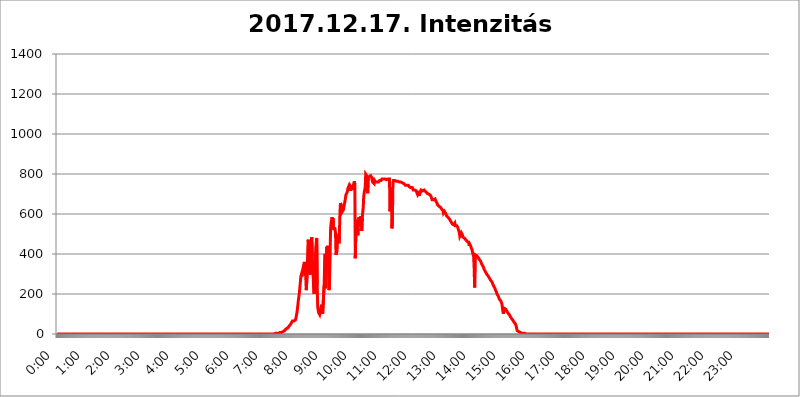
| Category | 2017.12.17. Intenzitás [W/m^2] |
|---|---|
| 0.0 | 0 |
| 0.0006944444444444445 | 0 |
| 0.001388888888888889 | 0 |
| 0.0020833333333333333 | 0 |
| 0.002777777777777778 | 0 |
| 0.003472222222222222 | 0 |
| 0.004166666666666667 | 0 |
| 0.004861111111111111 | 0 |
| 0.005555555555555556 | 0 |
| 0.0062499999999999995 | 0 |
| 0.006944444444444444 | 0 |
| 0.007638888888888889 | 0 |
| 0.008333333333333333 | 0 |
| 0.009027777777777779 | 0 |
| 0.009722222222222222 | 0 |
| 0.010416666666666666 | 0 |
| 0.011111111111111112 | 0 |
| 0.011805555555555555 | 0 |
| 0.012499999999999999 | 0 |
| 0.013194444444444444 | 0 |
| 0.013888888888888888 | 0 |
| 0.014583333333333332 | 0 |
| 0.015277777777777777 | 0 |
| 0.015972222222222224 | 0 |
| 0.016666666666666666 | 0 |
| 0.017361111111111112 | 0 |
| 0.018055555555555557 | 0 |
| 0.01875 | 0 |
| 0.019444444444444445 | 0 |
| 0.02013888888888889 | 0 |
| 0.020833333333333332 | 0 |
| 0.02152777777777778 | 0 |
| 0.022222222222222223 | 0 |
| 0.02291666666666667 | 0 |
| 0.02361111111111111 | 0 |
| 0.024305555555555556 | 0 |
| 0.024999999999999998 | 0 |
| 0.025694444444444447 | 0 |
| 0.02638888888888889 | 0 |
| 0.027083333333333334 | 0 |
| 0.027777777777777776 | 0 |
| 0.02847222222222222 | 0 |
| 0.029166666666666664 | 0 |
| 0.029861111111111113 | 0 |
| 0.030555555555555555 | 0 |
| 0.03125 | 0 |
| 0.03194444444444445 | 0 |
| 0.03263888888888889 | 0 |
| 0.03333333333333333 | 0 |
| 0.034027777777777775 | 0 |
| 0.034722222222222224 | 0 |
| 0.035416666666666666 | 0 |
| 0.036111111111111115 | 0 |
| 0.03680555555555556 | 0 |
| 0.0375 | 0 |
| 0.03819444444444444 | 0 |
| 0.03888888888888889 | 0 |
| 0.03958333333333333 | 0 |
| 0.04027777777777778 | 0 |
| 0.04097222222222222 | 0 |
| 0.041666666666666664 | 0 |
| 0.042361111111111106 | 0 |
| 0.04305555555555556 | 0 |
| 0.043750000000000004 | 0 |
| 0.044444444444444446 | 0 |
| 0.04513888888888889 | 0 |
| 0.04583333333333334 | 0 |
| 0.04652777777777778 | 0 |
| 0.04722222222222222 | 0 |
| 0.04791666666666666 | 0 |
| 0.04861111111111111 | 0 |
| 0.049305555555555554 | 0 |
| 0.049999999999999996 | 0 |
| 0.05069444444444445 | 0 |
| 0.051388888888888894 | 0 |
| 0.052083333333333336 | 0 |
| 0.05277777777777778 | 0 |
| 0.05347222222222222 | 0 |
| 0.05416666666666667 | 0 |
| 0.05486111111111111 | 0 |
| 0.05555555555555555 | 0 |
| 0.05625 | 0 |
| 0.05694444444444444 | 0 |
| 0.057638888888888885 | 0 |
| 0.05833333333333333 | 0 |
| 0.05902777777777778 | 0 |
| 0.059722222222222225 | 0 |
| 0.06041666666666667 | 0 |
| 0.061111111111111116 | 0 |
| 0.06180555555555556 | 0 |
| 0.0625 | 0 |
| 0.06319444444444444 | 0 |
| 0.06388888888888888 | 0 |
| 0.06458333333333334 | 0 |
| 0.06527777777777778 | 0 |
| 0.06597222222222222 | 0 |
| 0.06666666666666667 | 0 |
| 0.06736111111111111 | 0 |
| 0.06805555555555555 | 0 |
| 0.06874999999999999 | 0 |
| 0.06944444444444443 | 0 |
| 0.07013888888888889 | 0 |
| 0.07083333333333333 | 0 |
| 0.07152777777777779 | 0 |
| 0.07222222222222223 | 0 |
| 0.07291666666666667 | 0 |
| 0.07361111111111111 | 0 |
| 0.07430555555555556 | 0 |
| 0.075 | 0 |
| 0.07569444444444444 | 0 |
| 0.0763888888888889 | 0 |
| 0.07708333333333334 | 0 |
| 0.07777777777777778 | 0 |
| 0.07847222222222222 | 0 |
| 0.07916666666666666 | 0 |
| 0.0798611111111111 | 0 |
| 0.08055555555555556 | 0 |
| 0.08125 | 0 |
| 0.08194444444444444 | 0 |
| 0.08263888888888889 | 0 |
| 0.08333333333333333 | 0 |
| 0.08402777777777777 | 0 |
| 0.08472222222222221 | 0 |
| 0.08541666666666665 | 0 |
| 0.08611111111111112 | 0 |
| 0.08680555555555557 | 0 |
| 0.08750000000000001 | 0 |
| 0.08819444444444445 | 0 |
| 0.08888888888888889 | 0 |
| 0.08958333333333333 | 0 |
| 0.09027777777777778 | 0 |
| 0.09097222222222222 | 0 |
| 0.09166666666666667 | 0 |
| 0.09236111111111112 | 0 |
| 0.09305555555555556 | 0 |
| 0.09375 | 0 |
| 0.09444444444444444 | 0 |
| 0.09513888888888888 | 0 |
| 0.09583333333333333 | 0 |
| 0.09652777777777777 | 0 |
| 0.09722222222222222 | 0 |
| 0.09791666666666667 | 0 |
| 0.09861111111111111 | 0 |
| 0.09930555555555555 | 0 |
| 0.09999999999999999 | 0 |
| 0.10069444444444443 | 0 |
| 0.1013888888888889 | 0 |
| 0.10208333333333335 | 0 |
| 0.10277777777777779 | 0 |
| 0.10347222222222223 | 0 |
| 0.10416666666666667 | 0 |
| 0.10486111111111111 | 0 |
| 0.10555555555555556 | 0 |
| 0.10625 | 0 |
| 0.10694444444444444 | 0 |
| 0.1076388888888889 | 0 |
| 0.10833333333333334 | 0 |
| 0.10902777777777778 | 0 |
| 0.10972222222222222 | 0 |
| 0.1111111111111111 | 0 |
| 0.11180555555555556 | 0 |
| 0.11180555555555556 | 0 |
| 0.1125 | 0 |
| 0.11319444444444444 | 0 |
| 0.11388888888888889 | 0 |
| 0.11458333333333333 | 0 |
| 0.11527777777777777 | 0 |
| 0.11597222222222221 | 0 |
| 0.11666666666666665 | 0 |
| 0.1173611111111111 | 0 |
| 0.11805555555555557 | 0 |
| 0.11944444444444445 | 0 |
| 0.12013888888888889 | 0 |
| 0.12083333333333333 | 0 |
| 0.12152777777777778 | 0 |
| 0.12222222222222223 | 0 |
| 0.12291666666666667 | 0 |
| 0.12291666666666667 | 0 |
| 0.12361111111111112 | 0 |
| 0.12430555555555556 | 0 |
| 0.125 | 0 |
| 0.12569444444444444 | 0 |
| 0.12638888888888888 | 0 |
| 0.12708333333333333 | 0 |
| 0.16875 | 0 |
| 0.12847222222222224 | 0 |
| 0.12916666666666668 | 0 |
| 0.12986111111111112 | 0 |
| 0.13055555555555556 | 0 |
| 0.13125 | 0 |
| 0.13194444444444445 | 0 |
| 0.1326388888888889 | 0 |
| 0.13333333333333333 | 0 |
| 0.13402777777777777 | 0 |
| 0.13402777777777777 | 0 |
| 0.13472222222222222 | 0 |
| 0.13541666666666666 | 0 |
| 0.1361111111111111 | 0 |
| 0.13749999999999998 | 0 |
| 0.13819444444444443 | 0 |
| 0.1388888888888889 | 0 |
| 0.13958333333333334 | 0 |
| 0.14027777777777778 | 0 |
| 0.14097222222222222 | 0 |
| 0.14166666666666666 | 0 |
| 0.1423611111111111 | 0 |
| 0.14305555555555557 | 0 |
| 0.14375000000000002 | 0 |
| 0.14444444444444446 | 0 |
| 0.1451388888888889 | 0 |
| 0.1451388888888889 | 0 |
| 0.14652777777777778 | 0 |
| 0.14722222222222223 | 0 |
| 0.14791666666666667 | 0 |
| 0.1486111111111111 | 0 |
| 0.14930555555555555 | 0 |
| 0.15 | 0 |
| 0.15069444444444444 | 0 |
| 0.15138888888888888 | 0 |
| 0.15208333333333332 | 0 |
| 0.15277777777777776 | 0 |
| 0.15347222222222223 | 0 |
| 0.15416666666666667 | 0 |
| 0.15486111111111112 | 0 |
| 0.15555555555555556 | 0 |
| 0.15625 | 0 |
| 0.15694444444444444 | 0 |
| 0.15763888888888888 | 0 |
| 0.15833333333333333 | 0 |
| 0.15902777777777777 | 0 |
| 0.15972222222222224 | 0 |
| 0.16041666666666668 | 0 |
| 0.16111111111111112 | 0 |
| 0.16180555555555556 | 0 |
| 0.1625 | 0 |
| 0.16319444444444445 | 0 |
| 0.1638888888888889 | 0 |
| 0.16458333333333333 | 0 |
| 0.16527777777777777 | 0 |
| 0.16597222222222222 | 0 |
| 0.16666666666666666 | 0 |
| 0.1673611111111111 | 0 |
| 0.16805555555555554 | 0 |
| 0.16874999999999998 | 0 |
| 0.16944444444444443 | 0 |
| 0.17013888888888887 | 0 |
| 0.1708333333333333 | 0 |
| 0.17152777777777775 | 0 |
| 0.17222222222222225 | 0 |
| 0.1729166666666667 | 0 |
| 0.17361111111111113 | 0 |
| 0.17430555555555557 | 0 |
| 0.17500000000000002 | 0 |
| 0.17569444444444446 | 0 |
| 0.1763888888888889 | 0 |
| 0.17708333333333334 | 0 |
| 0.17777777777777778 | 0 |
| 0.17847222222222223 | 0 |
| 0.17916666666666667 | 0 |
| 0.1798611111111111 | 0 |
| 0.18055555555555555 | 0 |
| 0.18125 | 0 |
| 0.18194444444444444 | 0 |
| 0.1826388888888889 | 0 |
| 0.18333333333333335 | 0 |
| 0.1840277777777778 | 0 |
| 0.18472222222222223 | 0 |
| 0.18541666666666667 | 0 |
| 0.18611111111111112 | 0 |
| 0.18680555555555556 | 0 |
| 0.1875 | 0 |
| 0.18819444444444444 | 0 |
| 0.18888888888888888 | 0 |
| 0.18958333333333333 | 0 |
| 0.19027777777777777 | 0 |
| 0.1909722222222222 | 0 |
| 0.19166666666666665 | 0 |
| 0.19236111111111112 | 0 |
| 0.19305555555555554 | 0 |
| 0.19375 | 0 |
| 0.19444444444444445 | 0 |
| 0.1951388888888889 | 0 |
| 0.19583333333333333 | 0 |
| 0.19652777777777777 | 0 |
| 0.19722222222222222 | 0 |
| 0.19791666666666666 | 0 |
| 0.1986111111111111 | 0 |
| 0.19930555555555554 | 0 |
| 0.19999999999999998 | 0 |
| 0.20069444444444443 | 0 |
| 0.20138888888888887 | 0 |
| 0.2020833333333333 | 0 |
| 0.2027777777777778 | 0 |
| 0.2034722222222222 | 0 |
| 0.2041666666666667 | 0 |
| 0.20486111111111113 | 0 |
| 0.20555555555555557 | 0 |
| 0.20625000000000002 | 0 |
| 0.20694444444444446 | 0 |
| 0.2076388888888889 | 0 |
| 0.20833333333333334 | 0 |
| 0.20902777777777778 | 0 |
| 0.20972222222222223 | 0 |
| 0.21041666666666667 | 0 |
| 0.2111111111111111 | 0 |
| 0.21180555555555555 | 0 |
| 0.2125 | 0 |
| 0.21319444444444444 | 0 |
| 0.2138888888888889 | 0 |
| 0.21458333333333335 | 0 |
| 0.2152777777777778 | 0 |
| 0.21597222222222223 | 0 |
| 0.21666666666666667 | 0 |
| 0.21736111111111112 | 0 |
| 0.21805555555555556 | 0 |
| 0.21875 | 0 |
| 0.21944444444444444 | 0 |
| 0.22013888888888888 | 0 |
| 0.22083333333333333 | 0 |
| 0.22152777777777777 | 0 |
| 0.2222222222222222 | 0 |
| 0.22291666666666665 | 0 |
| 0.2236111111111111 | 0 |
| 0.22430555555555556 | 0 |
| 0.225 | 0 |
| 0.22569444444444445 | 0 |
| 0.2263888888888889 | 0 |
| 0.22708333333333333 | 0 |
| 0.22777777777777777 | 0 |
| 0.22847222222222222 | 0 |
| 0.22916666666666666 | 0 |
| 0.2298611111111111 | 0 |
| 0.23055555555555554 | 0 |
| 0.23124999999999998 | 0 |
| 0.23194444444444443 | 0 |
| 0.23263888888888887 | 0 |
| 0.2333333333333333 | 0 |
| 0.2340277777777778 | 0 |
| 0.2347222222222222 | 0 |
| 0.2354166666666667 | 0 |
| 0.23611111111111113 | 0 |
| 0.23680555555555557 | 0 |
| 0.23750000000000002 | 0 |
| 0.23819444444444446 | 0 |
| 0.2388888888888889 | 0 |
| 0.23958333333333334 | 0 |
| 0.24027777777777778 | 0 |
| 0.24097222222222223 | 0 |
| 0.24166666666666667 | 0 |
| 0.2423611111111111 | 0 |
| 0.24305555555555555 | 0 |
| 0.24375 | 0 |
| 0.24444444444444446 | 0 |
| 0.24513888888888888 | 0 |
| 0.24583333333333335 | 0 |
| 0.2465277777777778 | 0 |
| 0.24722222222222223 | 0 |
| 0.24791666666666667 | 0 |
| 0.24861111111111112 | 0 |
| 0.24930555555555556 | 0 |
| 0.25 | 0 |
| 0.25069444444444444 | 0 |
| 0.2513888888888889 | 0 |
| 0.2520833333333333 | 0 |
| 0.25277777777777777 | 0 |
| 0.2534722222222222 | 0 |
| 0.25416666666666665 | 0 |
| 0.2548611111111111 | 0 |
| 0.2555555555555556 | 0 |
| 0.25625000000000003 | 0 |
| 0.2569444444444445 | 0 |
| 0.2576388888888889 | 0 |
| 0.25833333333333336 | 0 |
| 0.2590277777777778 | 0 |
| 0.25972222222222224 | 0 |
| 0.2604166666666667 | 0 |
| 0.2611111111111111 | 0 |
| 0.26180555555555557 | 0 |
| 0.2625 | 0 |
| 0.26319444444444445 | 0 |
| 0.2638888888888889 | 0 |
| 0.26458333333333334 | 0 |
| 0.2652777777777778 | 0 |
| 0.2659722222222222 | 0 |
| 0.26666666666666666 | 0 |
| 0.2673611111111111 | 0 |
| 0.26805555555555555 | 0 |
| 0.26875 | 0 |
| 0.26944444444444443 | 0 |
| 0.2701388888888889 | 0 |
| 0.2708333333333333 | 0 |
| 0.27152777777777776 | 0 |
| 0.2722222222222222 | 0 |
| 0.27291666666666664 | 0 |
| 0.2736111111111111 | 0 |
| 0.2743055555555555 | 0 |
| 0.27499999999999997 | 0 |
| 0.27569444444444446 | 0 |
| 0.27638888888888885 | 0 |
| 0.27708333333333335 | 0 |
| 0.2777777777777778 | 0 |
| 0.27847222222222223 | 0 |
| 0.2791666666666667 | 0 |
| 0.2798611111111111 | 0 |
| 0.28055555555555556 | 0 |
| 0.28125 | 0 |
| 0.28194444444444444 | 0 |
| 0.2826388888888889 | 0 |
| 0.2833333333333333 | 0 |
| 0.28402777777777777 | 0 |
| 0.2847222222222222 | 0 |
| 0.28541666666666665 | 0 |
| 0.28611111111111115 | 0 |
| 0.28680555555555554 | 0 |
| 0.28750000000000003 | 0 |
| 0.2881944444444445 | 0 |
| 0.2888888888888889 | 0 |
| 0.28958333333333336 | 0 |
| 0.2902777777777778 | 0 |
| 0.29097222222222224 | 0 |
| 0.2916666666666667 | 0 |
| 0.2923611111111111 | 0 |
| 0.29305555555555557 | 0 |
| 0.29375 | 0 |
| 0.29444444444444445 | 0 |
| 0.2951388888888889 | 0 |
| 0.29583333333333334 | 0 |
| 0.2965277777777778 | 0 |
| 0.2972222222222222 | 0 |
| 0.29791666666666666 | 0 |
| 0.2986111111111111 | 0 |
| 0.29930555555555555 | 0 |
| 0.3 | 0 |
| 0.30069444444444443 | 0 |
| 0.3013888888888889 | 0 |
| 0.3020833333333333 | 0 |
| 0.30277777777777776 | 0 |
| 0.3034722222222222 | 3.525 |
| 0.30416666666666664 | 0 |
| 0.3048611111111111 | 3.525 |
| 0.3055555555555555 | 3.525 |
| 0.30624999999999997 | 3.525 |
| 0.3069444444444444 | 3.525 |
| 0.3076388888888889 | 3.525 |
| 0.30833333333333335 | 3.525 |
| 0.3090277777777778 | 3.525 |
| 0.30972222222222223 | 3.525 |
| 0.3104166666666667 | 3.525 |
| 0.3111111111111111 | 3.525 |
| 0.31180555555555556 | 7.887 |
| 0.3125 | 7.887 |
| 0.31319444444444444 | 7.887 |
| 0.3138888888888889 | 7.887 |
| 0.3145833333333333 | 7.887 |
| 0.31527777777777777 | 7.887 |
| 0.3159722222222222 | 12.257 |
| 0.31666666666666665 | 12.257 |
| 0.31736111111111115 | 12.257 |
| 0.31805555555555554 | 12.257 |
| 0.31875000000000003 | 16.636 |
| 0.3194444444444445 | 16.636 |
| 0.3201388888888889 | 21.024 |
| 0.32083333333333336 | 25.419 |
| 0.3215277777777778 | 25.419 |
| 0.32222222222222224 | 25.419 |
| 0.3229166666666667 | 29.823 |
| 0.3236111111111111 | 29.823 |
| 0.32430555555555557 | 34.234 |
| 0.325 | 38.653 |
| 0.32569444444444445 | 38.653 |
| 0.3263888888888889 | 43.079 |
| 0.32708333333333334 | 47.511 |
| 0.3277777777777778 | 51.951 |
| 0.3284722222222222 | 56.398 |
| 0.32916666666666666 | 60.85 |
| 0.3298611111111111 | 65.31 |
| 0.33055555555555555 | 65.31 |
| 0.33125 | 65.31 |
| 0.33194444444444443 | 65.31 |
| 0.3326388888888889 | 65.31 |
| 0.3333333333333333 | 69.775 |
| 0.3340277777777778 | 69.775 |
| 0.3347222222222222 | 78.722 |
| 0.3354166666666667 | 74.246 |
| 0.3361111111111111 | 105.69 |
| 0.3368055555555556 | 123.758 |
| 0.33749999999999997 | 146.423 |
| 0.33819444444444446 | 169.156 |
| 0.33888888888888885 | 187.378 |
| 0.33958333333333335 | 205.62 |
| 0.34027777777777773 | 233 |
| 0.34097222222222223 | 260.373 |
| 0.3416666666666666 | 287.709 |
| 0.3423611111111111 | 296.808 |
| 0.3430555555555555 | 287.709 |
| 0.34375 | 301.354 |
| 0.3444444444444445 | 324.052 |
| 0.3451388888888889 | 328.584 |
| 0.3458333333333334 | 324.052 |
| 0.34652777777777777 | 360.221 |
| 0.34722222222222227 | 351.198 |
| 0.34791666666666665 | 351.198 |
| 0.34861111111111115 | 278.603 |
| 0.34930555555555554 | 219.309 |
| 0.35000000000000003 | 223.873 |
| 0.3506944444444444 | 324.052 |
| 0.3513888888888889 | 427.39 |
| 0.3520833333333333 | 471.582 |
| 0.3527777777777778 | 471.582 |
| 0.3534722222222222 | 373.729 |
| 0.3541666666666667 | 305.898 |
| 0.3548611111111111 | 296.808 |
| 0.35555555555555557 | 391.685 |
| 0.35625 | 449.551 |
| 0.35694444444444445 | 484.735 |
| 0.3576388888888889 | 387.202 |
| 0.35833333333333334 | 337.639 |
| 0.3590277777777778 | 278.603 |
| 0.3597222222222222 | 210.182 |
| 0.36041666666666666 | 201.058 |
| 0.3611111111111111 | 228.436 |
| 0.36180555555555555 | 328.584 |
| 0.3625 | 427.39 |
| 0.36319444444444443 | 431.833 |
| 0.3638888888888889 | 480.356 |
| 0.3645833333333333 | 246.689 |
| 0.3652777777777778 | 137.347 |
| 0.3659722222222222 | 119.235 |
| 0.3666666666666667 | 105.69 |
| 0.3673611111111111 | 101.184 |
| 0.3680555555555556 | 96.682 |
| 0.36874999999999997 | 101.184 |
| 0.36944444444444446 | 119.235 |
| 0.37013888888888885 | 123.758 |
| 0.37083333333333335 | 146.423 |
| 0.37152777777777773 | 119.235 |
| 0.37222222222222223 | 101.184 |
| 0.3729166666666666 | 96.682 |
| 0.3736111111111111 | 105.69 |
| 0.3743055555555555 | 242.127 |
| 0.375 | 351.198 |
| 0.3756944444444445 | 400.638 |
| 0.3763888888888889 | 228.436 |
| 0.3770833333333334 | 305.898 |
| 0.37777777777777777 | 436.27 |
| 0.37847222222222227 | 427.39 |
| 0.37916666666666665 | 440.702 |
| 0.37986111111111115 | 414.035 |
| 0.38055555555555554 | 319.517 |
| 0.38125000000000003 | 219.309 |
| 0.3819444444444444 | 278.603 |
| 0.3826388888888889 | 387.202 |
| 0.3833333333333333 | 523.88 |
| 0.3840277777777778 | 553.986 |
| 0.3847222222222222 | 558.261 |
| 0.3854166666666667 | 583.779 |
| 0.3861111111111111 | 571.049 |
| 0.38680555555555557 | 579.542 |
| 0.3875 | 528.2 |
| 0.38819444444444445 | 519.555 |
| 0.3888888888888889 | 532.513 |
| 0.38958333333333334 | 523.88 |
| 0.3902777777777778 | 506.542 |
| 0.3909722222222222 | 396.164 |
| 0.39166666666666666 | 405.108 |
| 0.3923611111111111 | 414.035 |
| 0.39305555555555555 | 462.786 |
| 0.39375 | 458.38 |
| 0.39444444444444443 | 497.836 |
| 0.3951388888888889 | 453.968 |
| 0.3958333333333333 | 515.223 |
| 0.3965277777777778 | 609.062 |
| 0.3972222222222222 | 654.791 |
| 0.3979166666666667 | 658.909 |
| 0.3986111111111111 | 638.256 |
| 0.3993055555555556 | 609.062 |
| 0.39999999999999997 | 609.062 |
| 0.40069444444444446 | 613.252 |
| 0.40138888888888885 | 621.613 |
| 0.40208333333333335 | 625.784 |
| 0.40277777777777773 | 650.667 |
| 0.40347222222222223 | 663.019 |
| 0.4041666666666666 | 679.395 |
| 0.4048611111111111 | 695.666 |
| 0.4055555555555555 | 695.666 |
| 0.40625 | 699.717 |
| 0.4069444444444445 | 711.832 |
| 0.4076388888888889 | 727.896 |
| 0.4083333333333334 | 731.896 |
| 0.40902777777777777 | 739.877 |
| 0.40972222222222227 | 731.896 |
| 0.41041666666666665 | 715.858 |
| 0.41111111111111115 | 739.877 |
| 0.41180555555555554 | 743.859 |
| 0.41250000000000003 | 731.896 |
| 0.4131944444444444 | 743.859 |
| 0.4138888888888889 | 719.877 |
| 0.4145833333333333 | 731.896 |
| 0.4152777777777778 | 743.859 |
| 0.4159722222222222 | 747.834 |
| 0.4166666666666667 | 763.674 |
| 0.4173611111111111 | 747.834 |
| 0.41805555555555557 | 378.224 |
| 0.41875 | 510.885 |
| 0.41944444444444445 | 497.836 |
| 0.4201388888888889 | 571.049 |
| 0.42083333333333334 | 523.88 |
| 0.4215277777777778 | 493.475 |
| 0.4222222222222222 | 528.2 |
| 0.42291666666666666 | 583.779 |
| 0.4236111111111111 | 583.779 |
| 0.42430555555555555 | 562.53 |
| 0.425 | 566.793 |
| 0.42569444444444443 | 588.009 |
| 0.4263888888888889 | 562.53 |
| 0.4270833333333333 | 515.223 |
| 0.4277777777777778 | 579.542 |
| 0.4284722222222222 | 609.062 |
| 0.4291666666666667 | 634.105 |
| 0.4298611111111111 | 687.544 |
| 0.4305555555555556 | 707.8 |
| 0.43124999999999997 | 703.762 |
| 0.43194444444444446 | 735.89 |
| 0.43263888888888885 | 798.974 |
| 0.43333333333333335 | 795.074 |
| 0.43402777777777773 | 798.974 |
| 0.43472222222222223 | 787.258 |
| 0.4354166666666666 | 703.762 |
| 0.4361111111111111 | 779.42 |
| 0.4368055555555555 | 783.342 |
| 0.4375 | 787.258 |
| 0.4381944444444445 | 787.258 |
| 0.4388888888888889 | 791.169 |
| 0.4395833333333334 | 791.169 |
| 0.44027777777777777 | 787.258 |
| 0.44097222222222227 | 783.342 |
| 0.44166666666666665 | 771.559 |
| 0.44236111111111115 | 759.723 |
| 0.44305555555555554 | 759.723 |
| 0.44375000000000003 | 759.723 |
| 0.4444444444444444 | 751.803 |
| 0.4451388888888889 | 767.62 |
| 0.4458333333333333 | 771.559 |
| 0.4465277777777778 | 759.723 |
| 0.4472222222222222 | 763.674 |
| 0.4479166666666667 | 763.674 |
| 0.4486111111111111 | 759.723 |
| 0.44930555555555557 | 763.674 |
| 0.45 | 759.723 |
| 0.45069444444444445 | 759.723 |
| 0.4513888888888889 | 763.674 |
| 0.45208333333333334 | 767.62 |
| 0.4527777777777778 | 767.62 |
| 0.4534722222222222 | 767.62 |
| 0.45416666666666666 | 767.62 |
| 0.4548611111111111 | 771.559 |
| 0.45555555555555555 | 775.492 |
| 0.45625 | 775.492 |
| 0.45694444444444443 | 771.559 |
| 0.4576388888888889 | 775.492 |
| 0.4583333333333333 | 775.492 |
| 0.4590277777777778 | 775.492 |
| 0.4597222222222222 | 775.492 |
| 0.4604166666666667 | 775.492 |
| 0.4611111111111111 | 775.492 |
| 0.4618055555555556 | 771.559 |
| 0.46249999999999997 | 771.559 |
| 0.46319444444444446 | 775.492 |
| 0.46388888888888885 | 775.492 |
| 0.46458333333333335 | 775.492 |
| 0.46527777777777773 | 771.559 |
| 0.46597222222222223 | 775.492 |
| 0.4666666666666666 | 613.252 |
| 0.4673611111111111 | 654.791 |
| 0.4680555555555555 | 731.896 |
| 0.46875 | 703.762 |
| 0.4694444444444445 | 528.2 |
| 0.4701388888888889 | 583.779 |
| 0.4708333333333334 | 755.766 |
| 0.47152777777777777 | 767.62 |
| 0.47222222222222227 | 771.559 |
| 0.47291666666666665 | 771.559 |
| 0.47361111111111115 | 767.62 |
| 0.47430555555555554 | 767.62 |
| 0.47500000000000003 | 763.674 |
| 0.4756944444444444 | 763.674 |
| 0.4763888888888889 | 763.674 |
| 0.4770833333333333 | 763.674 |
| 0.4777777777777778 | 763.674 |
| 0.4784722222222222 | 759.723 |
| 0.4791666666666667 | 759.723 |
| 0.4798611111111111 | 759.723 |
| 0.48055555555555557 | 759.723 |
| 0.48125 | 759.723 |
| 0.48194444444444445 | 759.723 |
| 0.4826388888888889 | 759.723 |
| 0.48333333333333334 | 759.723 |
| 0.4840277777777778 | 755.766 |
| 0.4847222222222222 | 755.766 |
| 0.48541666666666666 | 755.766 |
| 0.4861111111111111 | 751.803 |
| 0.48680555555555555 | 751.803 |
| 0.4875 | 747.834 |
| 0.48819444444444443 | 743.859 |
| 0.4888888888888889 | 743.859 |
| 0.4895833333333333 | 743.859 |
| 0.4902777777777778 | 743.859 |
| 0.4909722222222222 | 743.859 |
| 0.4916666666666667 | 743.859 |
| 0.4923611111111111 | 743.859 |
| 0.4930555555555556 | 739.877 |
| 0.49374999999999997 | 735.89 |
| 0.49444444444444446 | 735.89 |
| 0.49513888888888885 | 735.89 |
| 0.49583333333333335 | 731.896 |
| 0.49652777777777773 | 727.896 |
| 0.49722222222222223 | 731.896 |
| 0.4979166666666666 | 731.896 |
| 0.4986111111111111 | 727.896 |
| 0.4993055555555555 | 719.877 |
| 0.5 | 719.877 |
| 0.5006944444444444 | 723.889 |
| 0.5013888888888889 | 719.877 |
| 0.5020833333333333 | 719.877 |
| 0.5027777777777778 | 715.858 |
| 0.5034722222222222 | 715.858 |
| 0.5041666666666667 | 707.8 |
| 0.5048611111111111 | 703.762 |
| 0.5055555555555555 | 695.666 |
| 0.50625 | 699.717 |
| 0.5069444444444444 | 703.762 |
| 0.5076388888888889 | 691.608 |
| 0.5083333333333333 | 699.717 |
| 0.5090277777777777 | 695.666 |
| 0.5097222222222222 | 711.832 |
| 0.5104166666666666 | 719.877 |
| 0.5111111111111112 | 719.877 |
| 0.5118055555555555 | 715.858 |
| 0.5125000000000001 | 715.858 |
| 0.5131944444444444 | 719.877 |
| 0.513888888888889 | 719.877 |
| 0.5145833333333333 | 719.877 |
| 0.5152777777777778 | 719.877 |
| 0.5159722222222222 | 715.858 |
| 0.5166666666666667 | 711.832 |
| 0.517361111111111 | 707.8 |
| 0.5180555555555556 | 707.8 |
| 0.5187499999999999 | 703.762 |
| 0.5194444444444445 | 703.762 |
| 0.5201388888888888 | 703.762 |
| 0.5208333333333334 | 699.717 |
| 0.5215277777777778 | 699.717 |
| 0.5222222222222223 | 695.666 |
| 0.5229166666666667 | 695.666 |
| 0.5236111111111111 | 695.666 |
| 0.5243055555555556 | 687.544 |
| 0.525 | 679.395 |
| 0.5256944444444445 | 671.22 |
| 0.5263888888888889 | 671.22 |
| 0.5270833333333333 | 675.311 |
| 0.5277777777777778 | 671.22 |
| 0.5284722222222222 | 667.123 |
| 0.5291666666666667 | 671.22 |
| 0.5298611111111111 | 675.311 |
| 0.5305555555555556 | 675.311 |
| 0.53125 | 663.019 |
| 0.5319444444444444 | 663.019 |
| 0.5326388888888889 | 654.791 |
| 0.5333333333333333 | 646.537 |
| 0.5340277777777778 | 642.4 |
| 0.5347222222222222 | 642.4 |
| 0.5354166666666667 | 638.256 |
| 0.5361111111111111 | 638.256 |
| 0.5368055555555555 | 638.256 |
| 0.5375 | 634.105 |
| 0.5381944444444444 | 629.948 |
| 0.5388888888888889 | 625.784 |
| 0.5395833333333333 | 625.784 |
| 0.5402777777777777 | 621.613 |
| 0.5409722222222222 | 617.436 |
| 0.5416666666666666 | 604.864 |
| 0.5423611111111112 | 609.062 |
| 0.5430555555555555 | 613.252 |
| 0.5437500000000001 | 609.062 |
| 0.5444444444444444 | 609.062 |
| 0.545138888888889 | 600.661 |
| 0.5458333333333333 | 592.233 |
| 0.5465277777777778 | 596.45 |
| 0.5472222222222222 | 588.009 |
| 0.5479166666666667 | 583.779 |
| 0.548611111111111 | 579.542 |
| 0.5493055555555556 | 583.779 |
| 0.5499999999999999 | 575.299 |
| 0.5506944444444445 | 571.049 |
| 0.5513888888888888 | 566.793 |
| 0.5520833333333334 | 562.53 |
| 0.5527777777777778 | 558.261 |
| 0.5534722222222223 | 558.261 |
| 0.5541666666666667 | 549.704 |
| 0.5548611111111111 | 549.704 |
| 0.5555555555555556 | 549.704 |
| 0.55625 | 545.416 |
| 0.5569444444444445 | 549.704 |
| 0.5576388888888889 | 553.986 |
| 0.5583333333333333 | 541.121 |
| 0.5590277777777778 | 536.82 |
| 0.5597222222222222 | 545.416 |
| 0.5604166666666667 | 541.121 |
| 0.5611111111111111 | 536.82 |
| 0.5618055555555556 | 532.513 |
| 0.5625 | 532.513 |
| 0.5631944444444444 | 515.223 |
| 0.5638888888888889 | 506.542 |
| 0.5645833333333333 | 489.108 |
| 0.5652777777777778 | 493.475 |
| 0.5659722222222222 | 493.475 |
| 0.5666666666666667 | 506.542 |
| 0.5673611111111111 | 506.542 |
| 0.5680555555555555 | 497.836 |
| 0.56875 | 484.735 |
| 0.5694444444444444 | 484.735 |
| 0.5701388888888889 | 484.735 |
| 0.5708333333333333 | 480.356 |
| 0.5715277777777777 | 480.356 |
| 0.5722222222222222 | 480.356 |
| 0.5729166666666666 | 471.582 |
| 0.5736111111111112 | 471.582 |
| 0.5743055555555555 | 467.187 |
| 0.5750000000000001 | 462.786 |
| 0.5756944444444444 | 462.786 |
| 0.576388888888889 | 462.786 |
| 0.5770833333333333 | 458.38 |
| 0.5777777777777778 | 440.702 |
| 0.5784722222222222 | 449.551 |
| 0.5791666666666667 | 449.551 |
| 0.579861111111111 | 440.702 |
| 0.5805555555555556 | 431.833 |
| 0.5812499999999999 | 427.39 |
| 0.5819444444444445 | 418.492 |
| 0.5826388888888888 | 405.108 |
| 0.5833333333333334 | 400.638 |
| 0.5840277777777778 | 387.202 |
| 0.5847222222222223 | 328.584 |
| 0.5854166666666667 | 233 |
| 0.5861111111111111 | 396.164 |
| 0.5868055555555556 | 396.164 |
| 0.5875 | 391.685 |
| 0.5881944444444445 | 391.685 |
| 0.5888888888888889 | 387.202 |
| 0.5895833333333333 | 387.202 |
| 0.5902777777777778 | 382.715 |
| 0.5909722222222222 | 382.715 |
| 0.5916666666666667 | 373.729 |
| 0.5923611111111111 | 369.23 |
| 0.5930555555555556 | 369.23 |
| 0.59375 | 364.728 |
| 0.5944444444444444 | 360.221 |
| 0.5951388888888889 | 351.198 |
| 0.5958333333333333 | 351.198 |
| 0.5965277777777778 | 342.162 |
| 0.5972222222222222 | 337.639 |
| 0.5979166666666667 | 333.113 |
| 0.5986111111111111 | 324.052 |
| 0.5993055555555555 | 319.517 |
| 0.6 | 314.98 |
| 0.6006944444444444 | 310.44 |
| 0.6013888888888889 | 305.898 |
| 0.6020833333333333 | 301.354 |
| 0.6027777777777777 | 296.808 |
| 0.6034722222222222 | 296.808 |
| 0.6041666666666666 | 292.259 |
| 0.6048611111111112 | 287.709 |
| 0.6055555555555555 | 283.156 |
| 0.6062500000000001 | 278.603 |
| 0.6069444444444444 | 278.603 |
| 0.607638888888889 | 269.49 |
| 0.6083333333333333 | 269.49 |
| 0.6090277777777778 | 264.932 |
| 0.6097222222222222 | 260.373 |
| 0.6104166666666667 | 255.813 |
| 0.611111111111111 | 246.689 |
| 0.6118055555555556 | 242.127 |
| 0.6124999999999999 | 237.564 |
| 0.6131944444444445 | 233 |
| 0.6138888888888888 | 228.436 |
| 0.6145833333333334 | 219.309 |
| 0.6152777777777778 | 214.746 |
| 0.6159722222222223 | 210.182 |
| 0.6166666666666667 | 201.058 |
| 0.6173611111111111 | 201.058 |
| 0.6180555555555556 | 196.497 |
| 0.61875 | 187.378 |
| 0.6194444444444445 | 182.82 |
| 0.6201388888888889 | 173.709 |
| 0.6208333333333333 | 173.709 |
| 0.6215277777777778 | 169.156 |
| 0.6222222222222222 | 164.605 |
| 0.6229166666666667 | 160.056 |
| 0.6236111111111111 | 150.964 |
| 0.6243055555555556 | 146.423 |
| 0.625 | 114.716 |
| 0.6256944444444444 | 101.184 |
| 0.6263888888888889 | 114.716 |
| 0.6270833333333333 | 128.284 |
| 0.6277777777777778 | 128.284 |
| 0.6284722222222222 | 128.284 |
| 0.6291666666666667 | 123.758 |
| 0.6298611111111111 | 119.235 |
| 0.6305555555555555 | 114.716 |
| 0.63125 | 110.201 |
| 0.6319444444444444 | 105.69 |
| 0.6326388888888889 | 105.69 |
| 0.6333333333333333 | 101.184 |
| 0.6340277777777777 | 96.682 |
| 0.6347222222222222 | 92.184 |
| 0.6354166666666666 | 87.692 |
| 0.6361111111111112 | 83.205 |
| 0.6368055555555555 | 78.722 |
| 0.6375000000000001 | 78.722 |
| 0.6381944444444444 | 74.246 |
| 0.638888888888889 | 69.775 |
| 0.6395833333333333 | 65.31 |
| 0.6402777777777778 | 60.85 |
| 0.6409722222222222 | 56.398 |
| 0.6416666666666667 | 56.398 |
| 0.642361111111111 | 51.951 |
| 0.6430555555555556 | 47.511 |
| 0.6437499999999999 | 38.653 |
| 0.6444444444444445 | 25.419 |
| 0.6451388888888888 | 16.636 |
| 0.6458333333333334 | 12.257 |
| 0.6465277777777778 | 12.257 |
| 0.6472222222222223 | 12.257 |
| 0.6479166666666667 | 12.257 |
| 0.6486111111111111 | 7.887 |
| 0.6493055555555556 | 7.887 |
| 0.65 | 7.887 |
| 0.6506944444444445 | 7.887 |
| 0.6513888888888889 | 3.525 |
| 0.6520833333333333 | 3.525 |
| 0.6527777777777778 | 3.525 |
| 0.6534722222222222 | 3.525 |
| 0.6541666666666667 | 3.525 |
| 0.6548611111111111 | 3.525 |
| 0.6555555555555556 | 3.525 |
| 0.65625 | 3.525 |
| 0.6569444444444444 | 0 |
| 0.6576388888888889 | 0 |
| 0.6583333333333333 | 0 |
| 0.6590277777777778 | 0 |
| 0.6597222222222222 | 0 |
| 0.6604166666666667 | 0 |
| 0.6611111111111111 | 0 |
| 0.6618055555555555 | 0 |
| 0.6625 | 0 |
| 0.6631944444444444 | 0 |
| 0.6638888888888889 | 0 |
| 0.6645833333333333 | 0 |
| 0.6652777777777777 | 0 |
| 0.6659722222222222 | 0 |
| 0.6666666666666666 | 0 |
| 0.6673611111111111 | 0 |
| 0.6680555555555556 | 0 |
| 0.6687500000000001 | 0 |
| 0.6694444444444444 | 0 |
| 0.6701388888888888 | 0 |
| 0.6708333333333334 | 0 |
| 0.6715277777777778 | 0 |
| 0.6722222222222222 | 0 |
| 0.6729166666666666 | 0 |
| 0.6736111111111112 | 0 |
| 0.6743055555555556 | 0 |
| 0.6749999999999999 | 0 |
| 0.6756944444444444 | 0 |
| 0.6763888888888889 | 0 |
| 0.6770833333333334 | 0 |
| 0.6777777777777777 | 0 |
| 0.6784722222222223 | 0 |
| 0.6791666666666667 | 0 |
| 0.6798611111111111 | 0 |
| 0.6805555555555555 | 0 |
| 0.68125 | 0 |
| 0.6819444444444445 | 0 |
| 0.6826388888888889 | 0 |
| 0.6833333333333332 | 0 |
| 0.6840277777777778 | 0 |
| 0.6847222222222222 | 0 |
| 0.6854166666666667 | 0 |
| 0.686111111111111 | 0 |
| 0.6868055555555556 | 0 |
| 0.6875 | 0 |
| 0.6881944444444444 | 0 |
| 0.688888888888889 | 0 |
| 0.6895833333333333 | 0 |
| 0.6902777777777778 | 0 |
| 0.6909722222222222 | 0 |
| 0.6916666666666668 | 0 |
| 0.6923611111111111 | 0 |
| 0.6930555555555555 | 0 |
| 0.69375 | 0 |
| 0.6944444444444445 | 0 |
| 0.6951388888888889 | 0 |
| 0.6958333333333333 | 0 |
| 0.6965277777777777 | 0 |
| 0.6972222222222223 | 0 |
| 0.6979166666666666 | 0 |
| 0.6986111111111111 | 0 |
| 0.6993055555555556 | 0 |
| 0.7000000000000001 | 0 |
| 0.7006944444444444 | 0 |
| 0.7013888888888888 | 0 |
| 0.7020833333333334 | 0 |
| 0.7027777777777778 | 0 |
| 0.7034722222222222 | 0 |
| 0.7041666666666666 | 0 |
| 0.7048611111111112 | 0 |
| 0.7055555555555556 | 0 |
| 0.7062499999999999 | 0 |
| 0.7069444444444444 | 0 |
| 0.7076388888888889 | 0 |
| 0.7083333333333334 | 0 |
| 0.7090277777777777 | 0 |
| 0.7097222222222223 | 0 |
| 0.7104166666666667 | 0 |
| 0.7111111111111111 | 0 |
| 0.7118055555555555 | 0 |
| 0.7125 | 0 |
| 0.7131944444444445 | 0 |
| 0.7138888888888889 | 0 |
| 0.7145833333333332 | 0 |
| 0.7152777777777778 | 0 |
| 0.7159722222222222 | 0 |
| 0.7166666666666667 | 0 |
| 0.717361111111111 | 0 |
| 0.7180555555555556 | 0 |
| 0.71875 | 0 |
| 0.7194444444444444 | 0 |
| 0.720138888888889 | 0 |
| 0.7208333333333333 | 0 |
| 0.7215277777777778 | 0 |
| 0.7222222222222222 | 0 |
| 0.7229166666666668 | 0 |
| 0.7236111111111111 | 0 |
| 0.7243055555555555 | 0 |
| 0.725 | 0 |
| 0.7256944444444445 | 0 |
| 0.7263888888888889 | 0 |
| 0.7270833333333333 | 0 |
| 0.7277777777777777 | 0 |
| 0.7284722222222223 | 0 |
| 0.7291666666666666 | 0 |
| 0.7298611111111111 | 0 |
| 0.7305555555555556 | 0 |
| 0.7312500000000001 | 0 |
| 0.7319444444444444 | 0 |
| 0.7326388888888888 | 0 |
| 0.7333333333333334 | 0 |
| 0.7340277777777778 | 0 |
| 0.7347222222222222 | 0 |
| 0.7354166666666666 | 0 |
| 0.7361111111111112 | 0 |
| 0.7368055555555556 | 0 |
| 0.7374999999999999 | 0 |
| 0.7381944444444444 | 0 |
| 0.7388888888888889 | 0 |
| 0.7395833333333334 | 0 |
| 0.7402777777777777 | 0 |
| 0.7409722222222223 | 0 |
| 0.7416666666666667 | 0 |
| 0.7423611111111111 | 0 |
| 0.7430555555555555 | 0 |
| 0.74375 | 0 |
| 0.7444444444444445 | 0 |
| 0.7451388888888889 | 0 |
| 0.7458333333333332 | 0 |
| 0.7465277777777778 | 0 |
| 0.7472222222222222 | 0 |
| 0.7479166666666667 | 0 |
| 0.748611111111111 | 0 |
| 0.7493055555555556 | 0 |
| 0.75 | 0 |
| 0.7506944444444444 | 0 |
| 0.751388888888889 | 0 |
| 0.7520833333333333 | 0 |
| 0.7527777777777778 | 0 |
| 0.7534722222222222 | 0 |
| 0.7541666666666668 | 0 |
| 0.7548611111111111 | 0 |
| 0.7555555555555555 | 0 |
| 0.75625 | 0 |
| 0.7569444444444445 | 0 |
| 0.7576388888888889 | 0 |
| 0.7583333333333333 | 0 |
| 0.7590277777777777 | 0 |
| 0.7597222222222223 | 0 |
| 0.7604166666666666 | 0 |
| 0.7611111111111111 | 0 |
| 0.7618055555555556 | 0 |
| 0.7625000000000001 | 0 |
| 0.7631944444444444 | 0 |
| 0.7638888888888888 | 0 |
| 0.7645833333333334 | 0 |
| 0.7652777777777778 | 0 |
| 0.7659722222222222 | 0 |
| 0.7666666666666666 | 0 |
| 0.7673611111111112 | 0 |
| 0.7680555555555556 | 0 |
| 0.7687499999999999 | 0 |
| 0.7694444444444444 | 0 |
| 0.7701388888888889 | 0 |
| 0.7708333333333334 | 0 |
| 0.7715277777777777 | 0 |
| 0.7722222222222223 | 0 |
| 0.7729166666666667 | 0 |
| 0.7736111111111111 | 0 |
| 0.7743055555555555 | 0 |
| 0.775 | 0 |
| 0.7756944444444445 | 0 |
| 0.7763888888888889 | 0 |
| 0.7770833333333332 | 0 |
| 0.7777777777777778 | 0 |
| 0.7784722222222222 | 0 |
| 0.7791666666666667 | 0 |
| 0.779861111111111 | 0 |
| 0.7805555555555556 | 0 |
| 0.78125 | 0 |
| 0.7819444444444444 | 0 |
| 0.782638888888889 | 0 |
| 0.7833333333333333 | 0 |
| 0.7840277777777778 | 0 |
| 0.7847222222222222 | 0 |
| 0.7854166666666668 | 0 |
| 0.7861111111111111 | 0 |
| 0.7868055555555555 | 0 |
| 0.7875 | 0 |
| 0.7881944444444445 | 0 |
| 0.7888888888888889 | 0 |
| 0.7895833333333333 | 0 |
| 0.7902777777777777 | 0 |
| 0.7909722222222223 | 0 |
| 0.7916666666666666 | 0 |
| 0.7923611111111111 | 0 |
| 0.7930555555555556 | 0 |
| 0.7937500000000001 | 0 |
| 0.7944444444444444 | 0 |
| 0.7951388888888888 | 0 |
| 0.7958333333333334 | 0 |
| 0.7965277777777778 | 0 |
| 0.7972222222222222 | 0 |
| 0.7979166666666666 | 0 |
| 0.7986111111111112 | 0 |
| 0.7993055555555556 | 0 |
| 0.7999999999999999 | 0 |
| 0.8006944444444444 | 0 |
| 0.8013888888888889 | 0 |
| 0.8020833333333334 | 0 |
| 0.8027777777777777 | 0 |
| 0.8034722222222223 | 0 |
| 0.8041666666666667 | 0 |
| 0.8048611111111111 | 0 |
| 0.8055555555555555 | 0 |
| 0.80625 | 0 |
| 0.8069444444444445 | 0 |
| 0.8076388888888889 | 0 |
| 0.8083333333333332 | 0 |
| 0.8090277777777778 | 0 |
| 0.8097222222222222 | 0 |
| 0.8104166666666667 | 0 |
| 0.811111111111111 | 0 |
| 0.8118055555555556 | 0 |
| 0.8125 | 0 |
| 0.8131944444444444 | 0 |
| 0.813888888888889 | 0 |
| 0.8145833333333333 | 0 |
| 0.8152777777777778 | 0 |
| 0.8159722222222222 | 0 |
| 0.8166666666666668 | 0 |
| 0.8173611111111111 | 0 |
| 0.8180555555555555 | 0 |
| 0.81875 | 0 |
| 0.8194444444444445 | 0 |
| 0.8201388888888889 | 0 |
| 0.8208333333333333 | 0 |
| 0.8215277777777777 | 0 |
| 0.8222222222222223 | 0 |
| 0.8229166666666666 | 0 |
| 0.8236111111111111 | 0 |
| 0.8243055555555556 | 0 |
| 0.8250000000000001 | 0 |
| 0.8256944444444444 | 0 |
| 0.8263888888888888 | 0 |
| 0.8270833333333334 | 0 |
| 0.8277777777777778 | 0 |
| 0.8284722222222222 | 0 |
| 0.8291666666666666 | 0 |
| 0.8298611111111112 | 0 |
| 0.8305555555555556 | 0 |
| 0.8312499999999999 | 0 |
| 0.8319444444444444 | 0 |
| 0.8326388888888889 | 0 |
| 0.8333333333333334 | 0 |
| 0.8340277777777777 | 0 |
| 0.8347222222222223 | 0 |
| 0.8354166666666667 | 0 |
| 0.8361111111111111 | 0 |
| 0.8368055555555555 | 0 |
| 0.8375 | 0 |
| 0.8381944444444445 | 0 |
| 0.8388888888888889 | 0 |
| 0.8395833333333332 | 0 |
| 0.8402777777777778 | 0 |
| 0.8409722222222222 | 0 |
| 0.8416666666666667 | 0 |
| 0.842361111111111 | 0 |
| 0.8430555555555556 | 0 |
| 0.84375 | 0 |
| 0.8444444444444444 | 0 |
| 0.845138888888889 | 0 |
| 0.8458333333333333 | 0 |
| 0.8465277777777778 | 0 |
| 0.8472222222222222 | 0 |
| 0.8479166666666668 | 0 |
| 0.8486111111111111 | 0 |
| 0.8493055555555555 | 0 |
| 0.85 | 0 |
| 0.8506944444444445 | 0 |
| 0.8513888888888889 | 0 |
| 0.8520833333333333 | 0 |
| 0.8527777777777777 | 0 |
| 0.8534722222222223 | 0 |
| 0.8541666666666666 | 0 |
| 0.8548611111111111 | 0 |
| 0.8555555555555556 | 0 |
| 0.8562500000000001 | 0 |
| 0.8569444444444444 | 0 |
| 0.8576388888888888 | 0 |
| 0.8583333333333334 | 0 |
| 0.8590277777777778 | 0 |
| 0.8597222222222222 | 0 |
| 0.8604166666666666 | 0 |
| 0.8611111111111112 | 0 |
| 0.8618055555555556 | 0 |
| 0.8624999999999999 | 0 |
| 0.8631944444444444 | 0 |
| 0.8638888888888889 | 0 |
| 0.8645833333333334 | 0 |
| 0.8652777777777777 | 0 |
| 0.8659722222222223 | 0 |
| 0.8666666666666667 | 0 |
| 0.8673611111111111 | 0 |
| 0.8680555555555555 | 0 |
| 0.86875 | 0 |
| 0.8694444444444445 | 0 |
| 0.8701388888888889 | 0 |
| 0.8708333333333332 | 0 |
| 0.8715277777777778 | 0 |
| 0.8722222222222222 | 0 |
| 0.8729166666666667 | 0 |
| 0.873611111111111 | 0 |
| 0.8743055555555556 | 0 |
| 0.875 | 0 |
| 0.8756944444444444 | 0 |
| 0.876388888888889 | 0 |
| 0.8770833333333333 | 0 |
| 0.8777777777777778 | 0 |
| 0.8784722222222222 | 0 |
| 0.8791666666666668 | 0 |
| 0.8798611111111111 | 0 |
| 0.8805555555555555 | 0 |
| 0.88125 | 0 |
| 0.8819444444444445 | 0 |
| 0.8826388888888889 | 0 |
| 0.8833333333333333 | 0 |
| 0.8840277777777777 | 0 |
| 0.8847222222222223 | 0 |
| 0.8854166666666666 | 0 |
| 0.8861111111111111 | 0 |
| 0.8868055555555556 | 0 |
| 0.8875000000000001 | 0 |
| 0.8881944444444444 | 0 |
| 0.8888888888888888 | 0 |
| 0.8895833333333334 | 0 |
| 0.8902777777777778 | 0 |
| 0.8909722222222222 | 0 |
| 0.8916666666666666 | 0 |
| 0.8923611111111112 | 0 |
| 0.8930555555555556 | 0 |
| 0.8937499999999999 | 0 |
| 0.8944444444444444 | 0 |
| 0.8951388888888889 | 0 |
| 0.8958333333333334 | 0 |
| 0.8965277777777777 | 0 |
| 0.8972222222222223 | 0 |
| 0.8979166666666667 | 0 |
| 0.8986111111111111 | 0 |
| 0.8993055555555555 | 0 |
| 0.9 | 0 |
| 0.9006944444444445 | 0 |
| 0.9013888888888889 | 0 |
| 0.9020833333333332 | 0 |
| 0.9027777777777778 | 0 |
| 0.9034722222222222 | 0 |
| 0.9041666666666667 | 0 |
| 0.904861111111111 | 0 |
| 0.9055555555555556 | 0 |
| 0.90625 | 0 |
| 0.9069444444444444 | 0 |
| 0.907638888888889 | 0 |
| 0.9083333333333333 | 0 |
| 0.9090277777777778 | 0 |
| 0.9097222222222222 | 0 |
| 0.9104166666666668 | 0 |
| 0.9111111111111111 | 0 |
| 0.9118055555555555 | 0 |
| 0.9125 | 0 |
| 0.9131944444444445 | 0 |
| 0.9138888888888889 | 0 |
| 0.9145833333333333 | 0 |
| 0.9152777777777777 | 0 |
| 0.9159722222222223 | 0 |
| 0.9166666666666666 | 0 |
| 0.9173611111111111 | 0 |
| 0.9180555555555556 | 0 |
| 0.9187500000000001 | 0 |
| 0.9194444444444444 | 0 |
| 0.9201388888888888 | 0 |
| 0.9208333333333334 | 0 |
| 0.9215277777777778 | 0 |
| 0.9222222222222222 | 0 |
| 0.9229166666666666 | 0 |
| 0.9236111111111112 | 0 |
| 0.9243055555555556 | 0 |
| 0.9249999999999999 | 0 |
| 0.9256944444444444 | 0 |
| 0.9263888888888889 | 0 |
| 0.9270833333333334 | 0 |
| 0.9277777777777777 | 0 |
| 0.9284722222222223 | 0 |
| 0.9291666666666667 | 0 |
| 0.9298611111111111 | 0 |
| 0.9305555555555555 | 0 |
| 0.93125 | 0 |
| 0.9319444444444445 | 0 |
| 0.9326388888888889 | 0 |
| 0.9333333333333332 | 0 |
| 0.9340277777777778 | 0 |
| 0.9347222222222222 | 0 |
| 0.9354166666666667 | 0 |
| 0.936111111111111 | 0 |
| 0.9368055555555556 | 0 |
| 0.9375 | 0 |
| 0.9381944444444444 | 0 |
| 0.938888888888889 | 0 |
| 0.9395833333333333 | 0 |
| 0.9402777777777778 | 0 |
| 0.9409722222222222 | 0 |
| 0.9416666666666668 | 0 |
| 0.9423611111111111 | 0 |
| 0.9430555555555555 | 0 |
| 0.94375 | 0 |
| 0.9444444444444445 | 0 |
| 0.9451388888888889 | 0 |
| 0.9458333333333333 | 0 |
| 0.9465277777777777 | 0 |
| 0.9472222222222223 | 0 |
| 0.9479166666666666 | 0 |
| 0.9486111111111111 | 0 |
| 0.9493055555555556 | 0 |
| 0.9500000000000001 | 0 |
| 0.9506944444444444 | 0 |
| 0.9513888888888888 | 0 |
| 0.9520833333333334 | 0 |
| 0.9527777777777778 | 0 |
| 0.9534722222222222 | 0 |
| 0.9541666666666666 | 0 |
| 0.9548611111111112 | 0 |
| 0.9555555555555556 | 0 |
| 0.9562499999999999 | 0 |
| 0.9569444444444444 | 0 |
| 0.9576388888888889 | 0 |
| 0.9583333333333334 | 0 |
| 0.9590277777777777 | 0 |
| 0.9597222222222223 | 0 |
| 0.9604166666666667 | 0 |
| 0.9611111111111111 | 0 |
| 0.9618055555555555 | 0 |
| 0.9625 | 0 |
| 0.9631944444444445 | 0 |
| 0.9638888888888889 | 0 |
| 0.9645833333333332 | 0 |
| 0.9652777777777778 | 0 |
| 0.9659722222222222 | 0 |
| 0.9666666666666667 | 0 |
| 0.967361111111111 | 0 |
| 0.9680555555555556 | 0 |
| 0.96875 | 0 |
| 0.9694444444444444 | 0 |
| 0.970138888888889 | 0 |
| 0.9708333333333333 | 0 |
| 0.9715277777777778 | 0 |
| 0.9722222222222222 | 0 |
| 0.9729166666666668 | 0 |
| 0.9736111111111111 | 0 |
| 0.9743055555555555 | 0 |
| 0.975 | 0 |
| 0.9756944444444445 | 0 |
| 0.9763888888888889 | 0 |
| 0.9770833333333333 | 0 |
| 0.9777777777777777 | 0 |
| 0.9784722222222223 | 0 |
| 0.9791666666666666 | 0 |
| 0.9798611111111111 | 0 |
| 0.9805555555555556 | 0 |
| 0.9812500000000001 | 0 |
| 0.9819444444444444 | 0 |
| 0.9826388888888888 | 0 |
| 0.9833333333333334 | 0 |
| 0.9840277777777778 | 0 |
| 0.9847222222222222 | 0 |
| 0.9854166666666666 | 0 |
| 0.9861111111111112 | 0 |
| 0.9868055555555556 | 0 |
| 0.9874999999999999 | 0 |
| 0.9881944444444444 | 0 |
| 0.9888888888888889 | 0 |
| 0.9895833333333334 | 0 |
| 0.9902777777777777 | 0 |
| 0.9909722222222223 | 0 |
| 0.9916666666666667 | 0 |
| 0.9923611111111111 | 0 |
| 0.9930555555555555 | 0 |
| 0.99375 | 0 |
| 0.9944444444444445 | 0 |
| 0.9951388888888889 | 0 |
| 0.9958333333333332 | 0 |
| 0.9965277777777778 | 0 |
| 0.9972222222222222 | 0 |
| 0.9979166666666667 | 0 |
| 0.998611111111111 | 0 |
| 0.9993055555555556 | 0 |